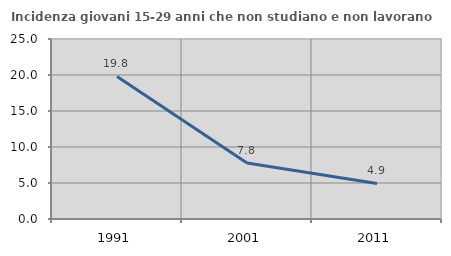
| Category | Incidenza giovani 15-29 anni che non studiano e non lavorano  |
|---|---|
| 1991.0 | 19.795 |
| 2001.0 | 7.778 |
| 2011.0 | 4.943 |